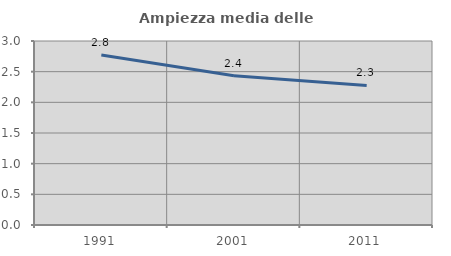
| Category | Ampiezza media delle famiglie |
|---|---|
| 1991.0 | 2.77 |
| 2001.0 | 2.435 |
| 2011.0 | 2.275 |